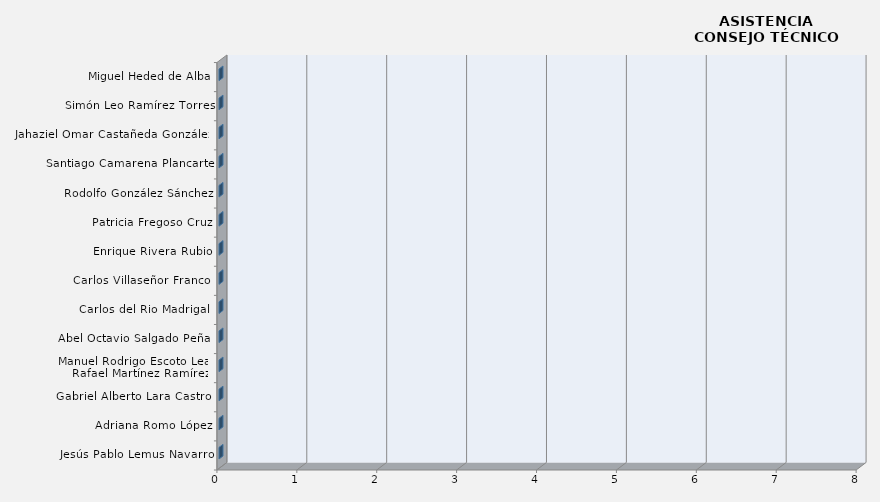
| Category | Series 0 |
|---|---|
| Jesús Pablo Lemus Navarro | 0 |
| Adriana Romo López | 0 |
| Gabriel Alberto Lara Castro  | 0 |
| Manuel Rodrigo Escoto Leal/
Rafael Martínez Ramírez   | 0 |
| Abel Octavio Salgado Peña  | 0 |
| Carlos del Rio Madrigal  | 0 |
| Carlos Villaseñor Franco  | 0 |
| Enrique Rivera Rubio | 0 |
| Patricia Fregoso Cruz | 0 |
| Rodolfo González Sánchez | 0 |
| Santiago Camarena Plancarte | 0 |
| Jahaziel Omar Castañeda González  | 0 |
| Simón Leo Ramírez Torres | 0 |
| Miguel Heded de Alba | 0 |